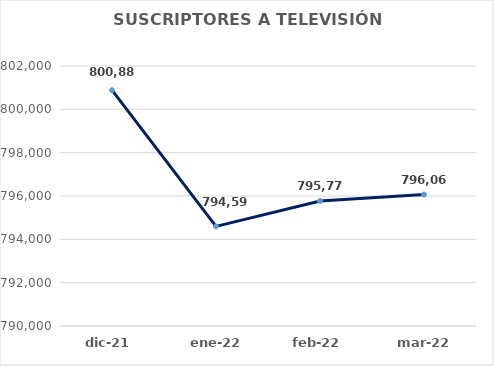
| Category | SUSCRIPTORES A TELEVISIÓN (Restringida) |
|---|---|
| 2021-12-01 | 800884 |
| 2022-01-01 | 794598 |
| 2022-02-01 | 795771 |
| 2022-03-01 | 796066.22 |